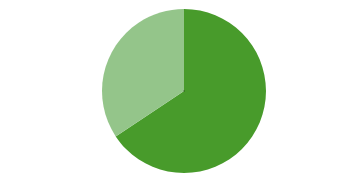
| Category | Män | Kvinnor | Series 2 |
|---|---|---|---|
| Män | 12274 | 6419 |  |